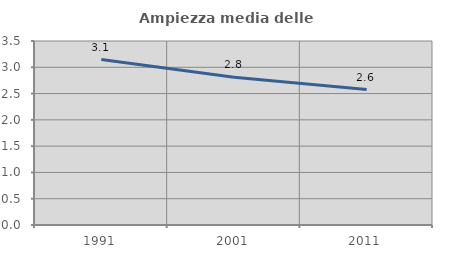
| Category | Ampiezza media delle famiglie |
|---|---|
| 1991.0 | 3.147 |
| 2001.0 | 2.812 |
| 2011.0 | 2.576 |